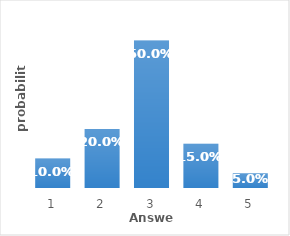
| Category | Series 0 |
|---|---|
| 0 | 0.1 |
| 1 | 0.2 |
| 2 | 0.5 |
| 3 | 0.15 |
| 4 | 0.05 |